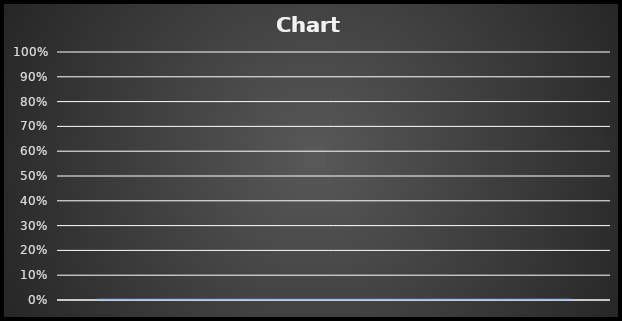
| Category | Sleep Efficiency for Week 5 | Goal |
|---|---|---|
|  | 0 |  |
|  | 0 |  |
|  | 0 |  |
|  | 0 |  |
|  | 0 |  |
|  | 0 |  |
|  | 0 |  |